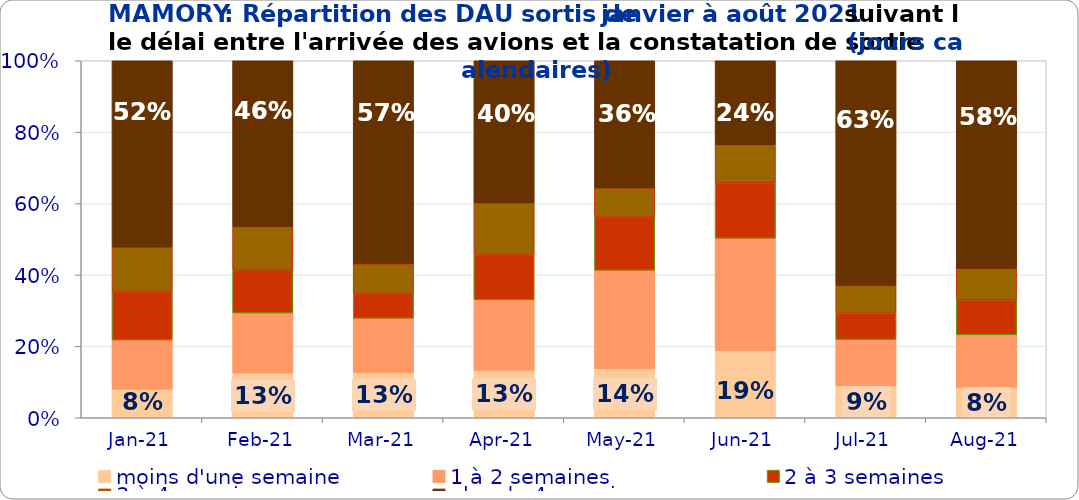
| Category | moins d'une semaine | 1 à 2 semaines | 2 à 3 semaines | 3 à 4 semaines | plus de 4 semaines |
|---|---|---|---|---|---|
| 2021-01-01 | 0.08 | 0.138 | 0.136 | 0.124 | 0.522 |
| 2021-02-01 | 0.125 | 0.168 | 0.122 | 0.121 | 0.464 |
| 2021-03-01 | 0.127 | 0.152 | 0.069 | 0.083 | 0.569 |
| 2021-04-01 | 0.133 | 0.197 | 0.127 | 0.145 | 0.398 |
| 2021-05-01 | 0.137 | 0.276 | 0.15 | 0.08 | 0.356 |
| 2021-06-01 | 0.188 | 0.315 | 0.155 | 0.106 | 0.235 |
| 2021-07-01 | 0.089 | 0.131 | 0.073 | 0.078 | 0.629 |
| 2021-08-01 | 0.085 | 0.147 | 0.099 | 0.088 | 0.582 |